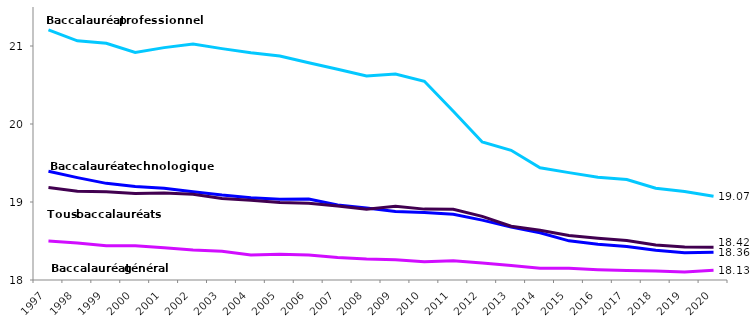
| Category | Baccalauréat général | Baccalauréat technologique | Baccalauréat professionnel | Tous baccalauréats |
|---|---|---|---|---|
| 1997.0 | 18.501 | 19.394 | 21.207 | 19.185 |
| 1998.0 | 18.475 | 19.313 | 21.067 | 19.139 |
| 1999.0 | 18.438 | 19.239 | 21.036 | 19.13 |
| 2000.0 | 18.44 | 19.2 | 20.918 | 19.109 |
| 2001.0 | 18.413 | 19.177 | 20.979 | 19.115 |
| 2002.0 | 18.383 | 19.13 | 21.025 | 19.099 |
| 2003.0 | 18.368 | 19.089 | 20.967 | 19.046 |
| 2004.0 | 18.322 | 19.055 | 20.913 | 19.021 |
| 2005.0 | 18.33 | 19.037 | 20.871 | 18.994 |
| 2006.0 | 18.319 | 19.038 | 20.785 | 18.985 |
| 2007.0 | 18.289 | 18.96 | 20.702 | 18.948 |
| 2008.0 | 18.27 | 18.923 | 20.615 | 18.908 |
| 2009.0 | 18.261 | 18.879 | 20.642 | 18.945 |
| 2010.0 | 18.235 | 18.864 | 20.547 | 18.909 |
| 2011.0 | 18.245 | 18.843 | 20.164 | 18.907 |
| 2012.0 | 18.217 | 18.768 | 19.769 | 18.816 |
| 2013.0 | 18.187 | 18.679 | 19.663 | 18.69 |
| 2014.0 | 18.151 | 18.607 | 19.438 | 18.638 |
| 2015.0 | 18.149 | 18.502 | 19.377 | 18.571 |
| 2016.0 | 18.133 | 18.46 | 19.319 | 18.535 |
| 2017.0 | 18.122 | 18.43 | 19.288 | 18.505 |
| 2018.0 | 18.115 | 18.38 | 19.176 | 18.45 |
| 2019.0 | 18.103 | 18.348 | 19.136 | 18.422 |
| 2020.0 | 18.125 | 18.356 | 19.074 | 18.421 |